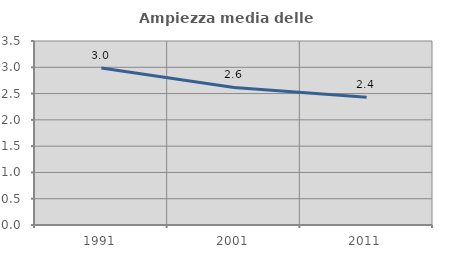
| Category | Ampiezza media delle famiglie |
|---|---|
| 1991.0 | 2.985 |
| 2001.0 | 2.618 |
| 2011.0 | 2.428 |